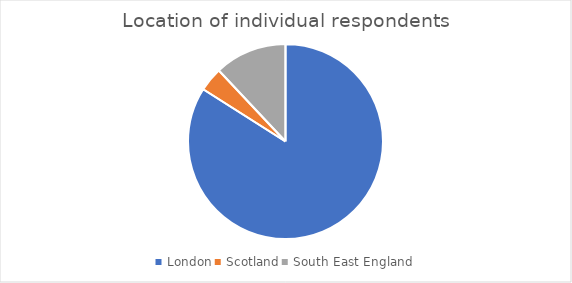
| Category | Number of respondents |
|---|---|
| London | 21 |
| Scotland | 1 |
| South East England | 3 |